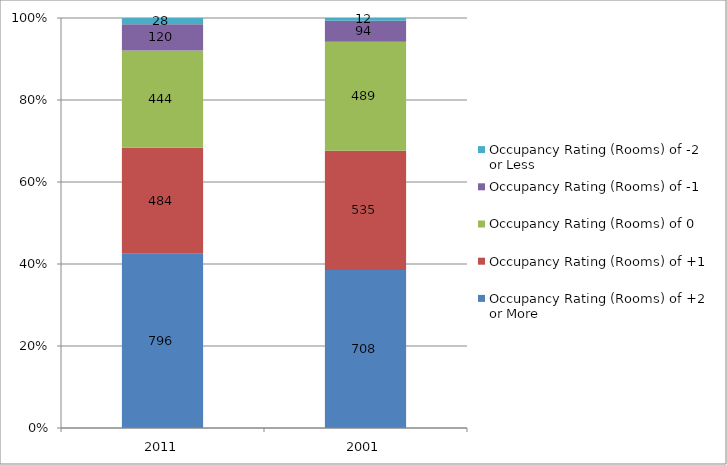
| Category | Occupancy Rating (Rooms) of +2 or More | Occupancy Rating (Rooms) of +1 | Occupancy Rating (Rooms) of 0 | Occupancy Rating (Rooms) of -1 | Occupancy Rating (Rooms) of -2 or Less |
|---|---|---|---|---|---|
| 2011.0 | 796 | 484 | 444 | 120 | 28 |
| 2001.0 | 708 | 535 | 489 | 94 | 12 |